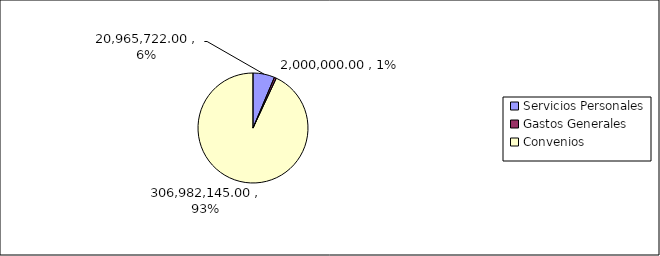
| Category | Series 0 |
|---|---|
| Servicios Personales | 20965722 |
| Gastos Generales | 2000000 |
| Convenios | 306982145 |